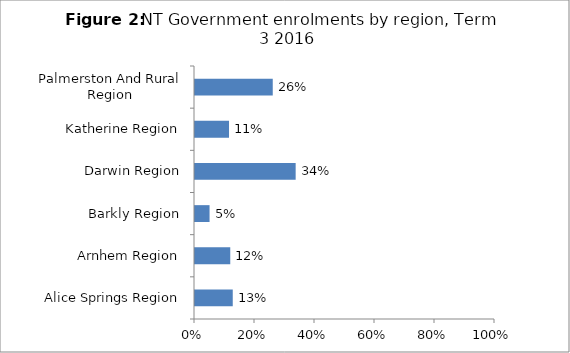
| Category | % |
|---|---|
| Alice Springs Region | 0.126 |
| Arnhem Region | 0.118 |
| Barkly Region | 0.049 |
| Darwin Region | 0.336 |
| Katherine Region | 0.113 |
| Palmerston And Rural Region | 0.259 |